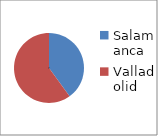
| Category | Series 0 |
|---|---|
| Salamanca | 2 |
| Valladolid | 3 |